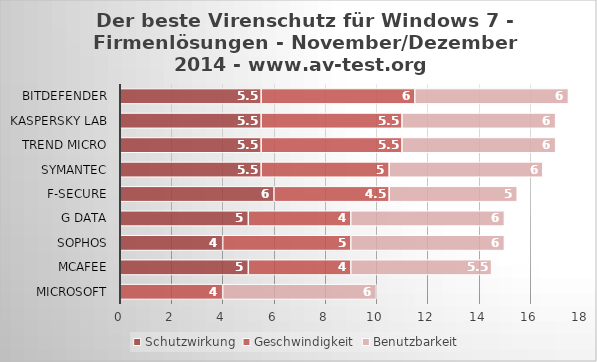
| Category | Schutzwirkung | Geschwindigkeit | Benutzbarkeit |
|---|---|---|---|
| Microsoft | 0 | 4 | 6 |
| McAfee | 5 | 4 | 5.5 |
| Sophos | 4 | 5 | 6 |
| G Data | 5 | 4 | 6 |
| F-Secure | 6 | 4.5 | 5 |
| Symantec | 5.5 | 5 | 6 |
| Trend Micro | 5.5 | 5.5 | 6 |
| Kaspersky Lab | 5.5 | 5.5 | 6 |
| Bitdefender | 5.5 | 6 | 6 |